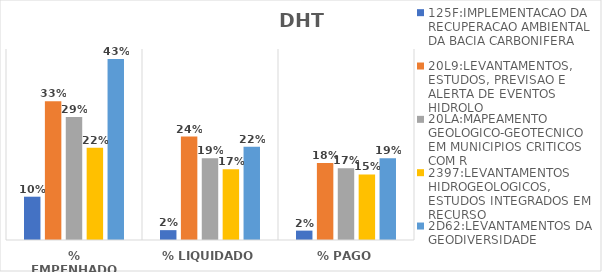
| Category | 125F:IMPLEMENTACAO DA RECUPERACAO AMBIENTAL DA BACIA CARBONIFERA | 20L9:LEVANTAMENTOS, ESTUDOS, PREVISAO E ALERTA DE EVENTOS HIDROLO | 20LA:MAPEAMENTO GEOLOGICO-GEOTECNICO EM MUNICIPIOS CRITICOS COM R | 2397:LEVANTAMENTOS HIDROGEOLOGICOS, ESTUDOS INTEGRADOS EM RECURSO | 2D62:LEVANTAMENTOS DA GEODIVERSIDADE |
|---|---|---|---|---|---|
| % EMPENHADO | 0.102 | 0.327 | 0.29 | 0.218 | 0.427 |
| % LIQUIDADO | 0.023 | 0.244 | 0.193 | 0.167 | 0.22 |
| % PAGO | 0.022 | 0.181 | 0.169 | 0.154 | 0.192 |